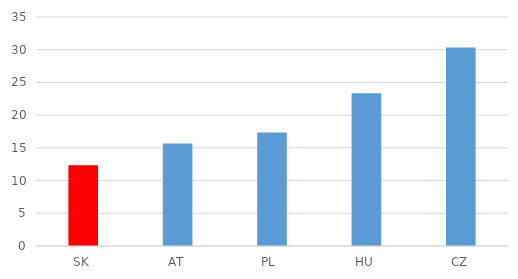
| Category | Series 0 |
|---|---|
| SK | 12.333 |
| AT | 15.667 |
| PL  | 17.333 |
| HU | 23.333 |
| CZ | 30.333 |